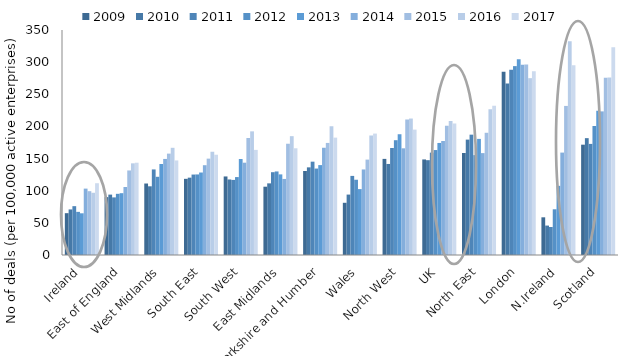
| Category | 2009 | 2010 | 2011 | 2012 | 2013 | 2014 | 2015 | 2016 | 2017 |
|---|---|---|---|---|---|---|---|---|---|
| Ireland | 65.05 | 70.872 | 75.971 | 67.105 | 64.868 | 103.253 | 99.259 | 96.787 | 111.655 |
| East of England | 89.985 | 93.934 | 89.601 | 95.162 | 96.156 | 105.764 | 131.512 | 142.589 | 143.538 |
| West Midlands | 111.198 | 106.853 | 133.109 | 121.652 | 141.571 | 149.423 | 157.707 | 166.737 | 147.088 |
| South East | 118.479 | 120.324 | 125.139 | 125.322 | 128.301 | 139.678 | 149.902 | 160.615 | 155.979 |
| South West | 122.187 | 117.482 | 116.805 | 121.206 | 149.296 | 143.582 | 181.97 | 192.345 | 163.502 |
| East Midlands | 106.248 | 111.444 | 128.808 | 129.97 | 125.392 | 118.308 | 173.079 | 184.872 | 166.004 |
| Yorkshire and Humber | 130.676 | 136.335 | 145.183 | 134.467 | 139.84 | 166.817 | 174.324 | 200.281 | 182.583 |
| Wales | 81.207 | 93.99 | 123.039 | 117.065 | 102.507 | 133.052 | 148.405 | 185.891 | 188.869 |
| North West | 149.516 | 141.613 | 166.418 | 178.571 | 187.858 | 165.955 | 210.595 | 212.281 | 195.058 |
| UK | 148.64 | 147.485 | 159.225 | 163.256 | 174.293 | 177.311 | 201.046 | 208.295 | 204.681 |
| North East | 158.655 | 179.485 | 187.183 | 155.355 | 180.604 | 158.488 | 190.114 | 226.675 | 232.28 |
| London | 285.1 | 266.66 | 287.997 | 293.806 | 304.633 | 295.912 | 296.503 | 275.075 | 285.898 |
| N.Ireland | 58.626 | 45.774 | 43.577 | 71.105 | 107.565 | 159.305 | 231.894 | 332.615 | 295.353 |
| Scotland | 171.608 | 181.766 | 172.818 | 200.859 | 224.373 | 223.4 | 275.898 | 276.291 | 323.106 |